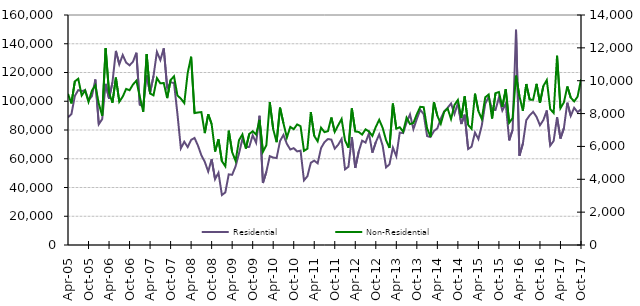
| Category | Residential |
|---|---|
| 2005-04-01 | 88840 |
| 2005-05-01 | 91030 |
| 2005-06-01 | 103700 |
| 2005-07-01 | 107770 |
| 2005-08-01 | 107040 |
| 2005-09-01 | 107710 |
| 2005-10-01 | 100650 |
| 2005-11-01 | 103570 |
| 2005-12-01 | 115150 |
| 2006-01-01 | 83980 |
| 2006-02-01 | 87550 |
| 2006-03-01 | 112090 |
| 2006-04-01 | 101830 |
| 2006-05-01 | 113160 |
| 2006-06-01 | 135030 |
| 2006-07-01 | 125720 |
| 2006-08-01 | 132180 |
| 2006-09-01 | 126890 |
| 2006-10-01 | 124980 |
| 2006-11-01 | 127530 |
| 2006-12-01 | 133770 |
| 2007-01-01 | 97580 |
| 2007-02-01 | 96560 |
| 2007-03-01 | 117970 |
| 2007-04-01 | 105780 |
| 2007-05-01 | 117560 |
| 2007-06-01 | 134370 |
| 2007-07-01 | 128660 |
| 2007-08-01 | 136790 |
| 2007-09-01 | 109250 |
| 2007-10-01 | 113080 |
| 2007-11-01 | 112770 |
| 2007-12-01 | 91140 |
| 2008-01-01 | 67220 |
| 2008-02-01 | 71820 |
| 2008-03-01 | 68100 |
| 2008-04-01 | 73130 |
| 2008-05-01 | 74470 |
| 2008-06-01 | 69150 |
| 2008-07-01 | 62400 |
| 2008-08-01 | 57810 |
| 2008-09-01 | 51080 |
| 2008-10-01 | 59710 |
| 2008-11-01 | 45780 |
| 2008-12-01 | 50260 |
| 2009-01-01 | 34750 |
| 2009-02-01 | 36580 |
| 2009-03-01 | 49130 |
| 2009-04-01 | 48840 |
| 2009-05-01 | 54720 |
| 2009-06-01 | 63710 |
| 2009-07-01 | 73760 |
| 2009-08-01 | 68080 |
| 2009-09-01 | 68260 |
| 2009-10-01 | 76320 |
| 2009-11-01 | 71150 |
| 2009-12-01 | 89920 |
| 2010-01-01 | 43110 |
| 2010-02-01 | 50920 |
| 2010-03-01 | 61810 |
| 2010-04-01 | 60830 |
| 2010-05-01 | 60500 |
| 2010-06-01 | 72370 |
| 2010-07-01 | 76590 |
| 2010-08-01 | 70320 |
| 2010-09-01 | 66440 |
| 2010-10-01 | 67380 |
| 2010-11-01 | 65080 |
| 2010-12-01 | 65650 |
| 2011-01-01 | 44970 |
| 2011-02-01 | 47830 |
| 2011-03-01 | 57200 |
| 2011-04-01 | 58700 |
| 2011-05-01 | 56820 |
| 2011-06-01 | 67500 |
| 2011-07-01 | 71550 |
| 2011-08-01 | 73720 |
| 2011-09-01 | 73310 |
| 2011-10-01 | 67030 |
| 2011-11-01 | 69730 |
| 2011-12-01 | 73780 |
| 2012-01-01 | 52630 |
| 2012-02-01 | 54440 |
| 2012-03-01 | 74960 |
| 2012-04-01 | 53590 |
| 2012-05-01 | 64960 |
| 2012-06-01 | 72590 |
| 2012-07-01 | 71240 |
| 2012-08-01 | 77690 |
| 2012-09-01 | 64200 |
| 2012-10-01 | 71490 |
| 2012-11-01 | 76910 |
| 2012-12-01 | 69100 |
| 2013-01-01 | 53990 |
| 2013-02-01 | 56120 |
| 2013-03-01 | 67740 |
| 2013-04-01 | 61780 |
| 2013-05-01 | 78170 |
| 2013-06-01 | 77850 |
| 2013-07-01 | 85310 |
| 2013-08-01 | 90850 |
| 2013-09-01 | 80640 |
| 2013-10-01 | 87730 |
| 2013-11-01 | 94020 |
| 2013-12-01 | 91030 |
| 2014-01-01 | 75750 |
| 2014-02-01 | 75100 |
| 2014-03-01 | 79280 |
| 2014-04-01 | 81140 |
| 2014-05-01 | 87930 |
| 2014-06-01 | 92950 |
| 2014-07-01 | 95430 |
| 2014-08-01 | 98450 |
| 2014-09-01 | 91170 |
| 2014-10-01 | 98630 |
| 2014-11-01 | 84150 |
| 2014-12-01 | 90650 |
| 2015-01-01 | 66750 |
| 2015-02-01 | 68390 |
| 2015-03-01 | 78240 |
| 2015-04-01 | 73690 |
| 2015-05-01 | 83310 |
| 2015-06-01 | 98200 |
| 2015-07-01 | 103160 |
| 2015-08-01 | 94260 |
| 2015-09-01 | 93940 |
| 2015-10-01 | 102540 |
| 2015-11-01 | 93490 |
| 2015-12-01 | 98400 |
| 2016-01-01 | 72750 |
| 2016-02-01 | 80110 |
| 2016-03-01 | 149710 |
| 2016-04-01 | 62150 |
| 2016-05-01 | 70480 |
| 2016-06-01 | 86840 |
| 2016-07-01 | 90220 |
| 2016-08-01 | 92660 |
| 2016-09-01 | 89130 |
| 2016-10-01 | 83270 |
| 2016-11-01 | 86930 |
| 2016-12-01 | 93570 |
| 2017-01-01 | 69120 |
| 2017-02-01 | 72400 |
| 2017-03-01 | 88860 |
| 2017-04-01 | 74050 |
| 2017-05-01 | 81270 |
| 2017-06-01 | 98990 |
| 2017-07-01 | 89820 |
| 2017-08-01 | 95450 |
| 2017-09-01 | 92400 |
| 2017-10-01 | 94340 |